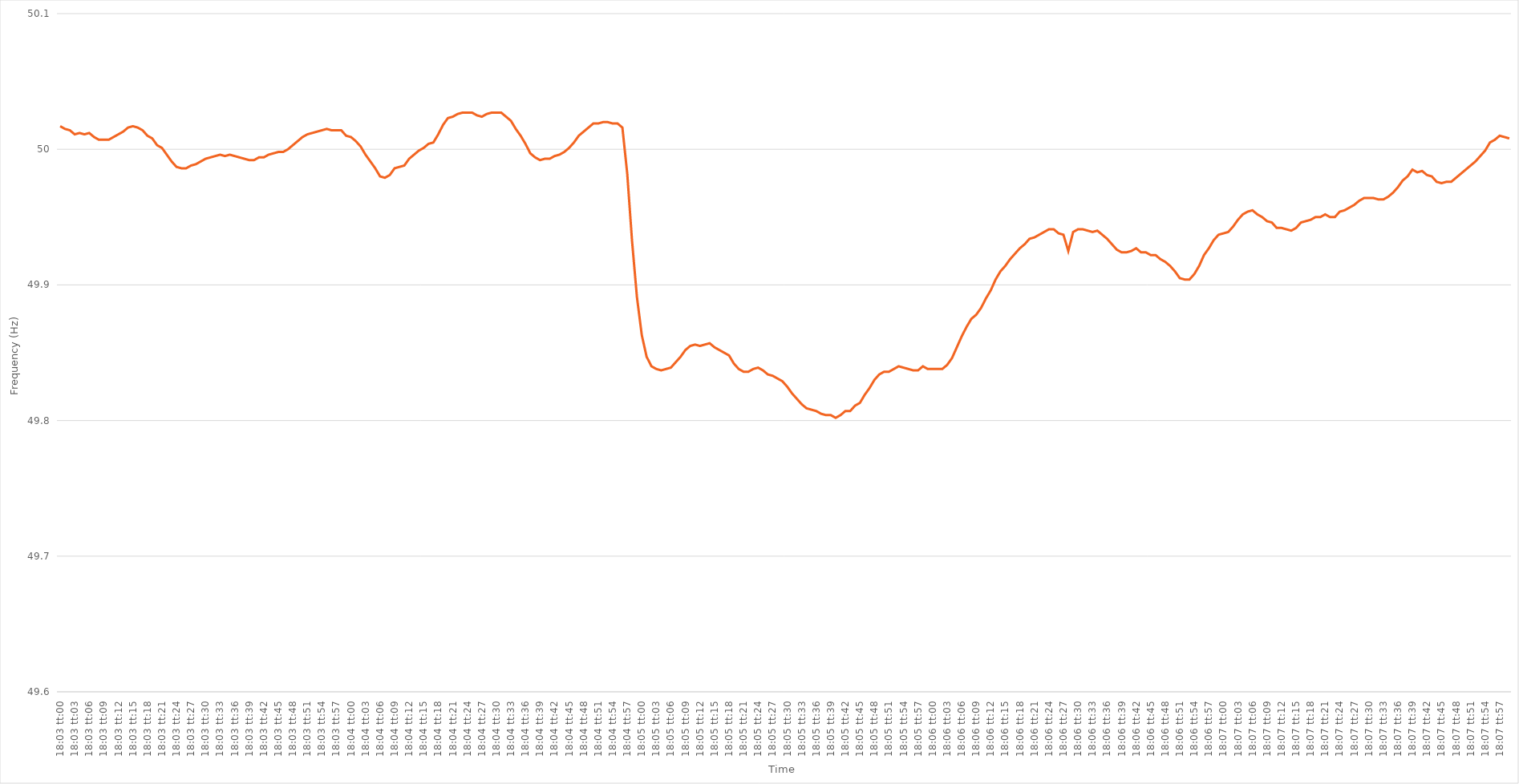
| Category | Series 0 |
|---|---|
| 0.7520833333333333 | 50.017 |
| 0.7520949074074075 | 50.015 |
| 0.7521064814814814 | 50.014 |
| 0.7521180555555556 | 50.011 |
| 0.7521296296296297 | 50.012 |
| 0.7521412037037036 | 50.011 |
| 0.7521527777777778 | 50.012 |
| 0.7521643518518518 | 50.009 |
| 0.752175925925926 | 50.007 |
| 0.7521874999999999 | 50.007 |
| 0.752199074074074 | 50.007 |
| 0.7522106481481482 | 50.009 |
| 0.7522222222222222 | 50.011 |
| 0.7522337962962963 | 50.013 |
| 0.7522453703703703 | 50.016 |
| 0.7522569444444445 | 50.017 |
| 0.7522685185185186 | 50.016 |
| 0.7522800925925925 | 50.014 |
| 0.7522916666666667 | 50.01 |
| 0.7523032407407407 | 50.008 |
| 0.7523148148148149 | 50.003 |
| 0.7523263888888888 | 50.001 |
| 0.752337962962963 | 49.996 |
| 0.7523495370370371 | 49.991 |
| 0.7523611111111111 | 49.987 |
| 0.7523726851851852 | 49.986 |
| 0.7523842592592592 | 49.986 |
| 0.7523958333333334 | 49.988 |
| 0.7524074074074073 | 49.989 |
| 0.7524189814814815 | 49.991 |
| 0.7524305555555556 | 49.993 |
| 0.7524421296296296 | 49.994 |
| 0.7524537037037037 | 49.995 |
| 0.7524652777777777 | 49.996 |
| 0.7524768518518519 | 49.995 |
| 0.752488425925926 | 49.996 |
| 0.7525 | 49.995 |
| 0.7525115740740741 | 49.994 |
| 0.7525231481481481 | 49.993 |
| 0.7525347222222223 | 49.992 |
| 0.7525462962962962 | 49.992 |
| 0.7525578703703704 | 49.994 |
| 0.7525694444444445 | 49.994 |
| 0.7525810185185186 | 49.996 |
| 0.7525925925925926 | 49.997 |
| 0.7526041666666666 | 49.998 |
| 0.7526157407407408 | 49.998 |
| 0.7526273148148147 | 50 |
| 0.7526388888888889 | 50.003 |
| 0.752650462962963 | 50.006 |
| 0.752662037037037 | 50.009 |
| 0.7526736111111111 | 50.011 |
| 0.7526851851851851 | 50.012 |
| 0.7526967592592593 | 50.013 |
| 0.7527083333333334 | 50.014 |
| 0.7527199074074074 | 50.015 |
| 0.7527314814814815 | 50.014 |
| 0.7527430555555555 | 50.014 |
| 0.7527546296296297 | 50.014 |
| 0.7527662037037036 | 50.01 |
| 0.7527777777777778 | 50.009 |
| 0.7527893518518519 | 50.006 |
| 0.752800925925926 | 50.002 |
| 0.7528125 | 49.996 |
| 0.752824074074074 | 49.991 |
| 0.7528356481481482 | 49.986 |
| 0.7528472222222221 | 49.98 |
| 0.7528587962962963 | 49.979 |
| 0.7528703703703704 | 49.981 |
| 0.7528819444444445 | 49.986 |
| 0.7528935185185185 | 49.987 |
| 0.7529050925925925 | 49.988 |
| 0.7529166666666667 | 49.993 |
| 0.7529282407407408 | 49.996 |
| 0.7529398148148148 | 49.999 |
| 0.7529513888888889 | 50.001 |
| 0.752962962962963 | 50.004 |
| 0.7529745370370371 | 50.005 |
| 0.752986111111111 | 50.011 |
| 0.7529976851851852 | 50.018 |
| 0.7530092592592593 | 50.023 |
| 0.7530208333333334 | 50.024 |
| 0.7530324074074074 | 50.026 |
| 0.7530439814814814 | 50.027 |
| 0.7530555555555556 | 50.027 |
| 0.7530671296296297 | 50.027 |
| 0.7530787037037037 | 50.025 |
| 0.7530902777777778 | 50.024 |
| 0.7531018518518519 | 50.026 |
| 0.7531134259259259 | 50.027 |
| 0.7531249999999999 | 50.027 |
| 0.7531365740740741 | 50.027 |
| 0.7531481481481482 | 50.024 |
| 0.7531597222222222 | 50.021 |
| 0.7531712962962963 | 50.015 |
| 0.7531828703703703 | 50.01 |
| 0.7531944444444445 | 50.004 |
| 0.7532060185185184 | 49.997 |
| 0.7532175925925926 | 49.994 |
| 0.7532291666666667 | 49.992 |
| 0.7532407407407408 | 49.993 |
| 0.7532523148148148 | 49.993 |
| 0.7532638888888888 | 49.995 |
| 0.753275462962963 | 49.996 |
| 0.7532870370370371 | 49.998 |
| 0.7532986111111111 | 50.001 |
| 0.7533101851851852 | 50.005 |
| 0.7533217592592593 | 50.01 |
| 0.7533333333333333 | 50.013 |
| 0.7533449074074073 | 50.016 |
| 0.7533564814814815 | 50.019 |
| 0.7533680555555556 | 50.019 |
| 0.7533796296296296 | 50.02 |
| 0.7533912037037037 | 50.02 |
| 0.7534027777777778 | 50.019 |
| 0.7534143518518519 | 50.019 |
| 0.7534259259259258 | 50.016 |
| 0.7534375 | 49.982 |
| 0.7534490740740741 | 49.932 |
| 0.7534606481481482 | 49.891 |
| 0.7534722222222222 | 49.863 |
| 0.7534837962962962 | 49.847 |
| 0.7534953703703704 | 49.84 |
| 0.7535069444444445 | 49.838 |
| 0.7535185185185185 | 49.837 |
| 0.7535300925925926 | 49.838 |
| 0.7535416666666667 | 49.839 |
| 0.7535532407407407 | 49.843 |
| 0.7535648148148147 | 49.847 |
| 0.7535763888888889 | 49.852 |
| 0.753587962962963 | 49.855 |
| 0.753599537037037 | 49.856 |
| 0.7536111111111111 | 49.855 |
| 0.7536226851851852 | 49.856 |
| 0.7536342592592593 | 49.857 |
| 0.7536458333333332 | 49.854 |
| 0.7536574074074074 | 49.852 |
| 0.7536689814814815 | 49.85 |
| 0.7536805555555556 | 49.848 |
| 0.7536921296296296 | 49.842 |
| 0.7537037037037037 | 49.838 |
| 0.7537152777777778 | 49.836 |
| 0.753726851851852 | 49.836 |
| 0.7537384259259259 | 49.838 |
| 0.75375 | 49.839 |
| 0.7537615740740741 | 49.837 |
| 0.7537731481481482 | 49.834 |
| 0.7537847222222221 | 49.833 |
| 0.7537962962962963 | 49.831 |
| 0.7538078703703704 | 49.829 |
| 0.7538194444444444 | 49.825 |
| 0.7538310185185185 | 49.82 |
| 0.7538425925925926 | 49.816 |
| 0.7538541666666667 | 49.812 |
| 0.7538657407407406 | 49.809 |
| 0.7538773148148148 | 49.808 |
| 0.7538888888888889 | 49.807 |
| 0.753900462962963 | 49.805 |
| 0.753912037037037 | 49.804 |
| 0.7539236111111111 | 49.804 |
| 0.7539351851851852 | 49.802 |
| 0.7539467592592594 | 49.804 |
| 0.7539583333333333 | 49.807 |
| 0.7539699074074074 | 49.807 |
| 0.7539814814814815 | 49.811 |
| 0.7539930555555556 | 49.813 |
| 0.7540046296296296 | 49.819 |
| 0.7540162037037037 | 49.824 |
| 0.7540277777777779 | 49.83 |
| 0.7540393518518518 | 49.834 |
| 0.7540509259259259 | 49.836 |
| 0.7540625 | 49.836 |
| 0.7540740740740741 | 49.838 |
| 0.754085648148148 | 49.84 |
| 0.7540972222222222 | 49.839 |
| 0.7541087962962963 | 49.838 |
| 0.7541203703703704 | 49.837 |
| 0.7541319444444444 | 49.837 |
| 0.7541435185185185 | 49.84 |
| 0.7541550925925926 | 49.838 |
| 0.7541666666666668 | 49.838 |
| 0.7541782407407407 | 49.838 |
| 0.7541898148148148 | 49.838 |
| 0.7542013888888889 | 49.841 |
| 0.754212962962963 | 49.846 |
| 0.754224537037037 | 49.854 |
| 0.7542361111111111 | 49.862 |
| 0.7542476851851853 | 49.869 |
| 0.7542592592592593 | 49.875 |
| 0.7542708333333333 | 49.878 |
| 0.7542824074074074 | 49.883 |
| 0.7542939814814815 | 49.89 |
| 0.7543055555555555 | 49.896 |
| 0.7543171296296296 | 49.904 |
| 0.7543287037037038 | 49.91 |
| 0.7543402777777778 | 49.914 |
| 0.7543518518518518 | 49.919 |
| 0.7543634259259259 | 49.923 |
| 0.754375 | 49.927 |
| 0.7543865740740742 | 49.93 |
| 0.7543981481481481 | 49.934 |
| 0.7544097222222222 | 49.935 |
| 0.7544212962962963 | 49.937 |
| 0.7544328703703704 | 49.939 |
| 0.7544444444444444 | 49.941 |
| 0.7544560185185185 | 49.941 |
| 0.7544675925925927 | 49.938 |
| 0.7544791666666667 | 49.937 |
| 0.7544907407407407 | 49.925 |
| 0.7545023148148148 | 49.939 |
| 0.7545138888888889 | 49.941 |
| 0.7545254629629629 | 49.941 |
| 0.754537037037037 | 49.94 |
| 0.7545486111111112 | 49.939 |
| 0.7545601851851852 | 49.94 |
| 0.7545717592592592 | 49.937 |
| 0.7545833333333333 | 49.934 |
| 0.7545949074074074 | 49.93 |
| 0.7546064814814816 | 49.926 |
| 0.7546180555555555 | 49.924 |
| 0.7546296296296297 | 49.924 |
| 0.7546412037037037 | 49.925 |
| 0.7546527777777778 | 49.927 |
| 0.7546643518518518 | 49.924 |
| 0.7546759259259259 | 49.924 |
| 0.7546875000000001 | 49.922 |
| 0.7546990740740741 | 49.922 |
| 0.7547106481481481 | 49.919 |
| 0.7547222222222222 | 49.917 |
| 0.7547337962962963 | 49.914 |
| 0.7547453703703703 | 49.91 |
| 0.7547569444444444 | 49.905 |
| 0.7547685185185186 | 49.904 |
| 0.7547800925925926 | 49.904 |
| 0.7547916666666666 | 49.908 |
| 0.7548032407407407 | 49.914 |
| 0.7548148148148148 | 49.922 |
| 0.754826388888889 | 49.927 |
| 0.7548379629629629 | 49.933 |
| 0.754849537037037 | 49.937 |
| 0.7548611111111111 | 49.938 |
| 0.7548726851851852 | 49.939 |
| 0.7548842592592592 | 49.943 |
| 0.7548958333333333 | 49.948 |
| 0.7549074074074075 | 49.952 |
| 0.7549189814814815 | 49.954 |
| 0.7549305555555555 | 49.955 |
| 0.7549421296296296 | 49.952 |
| 0.7549537037037037 | 49.95 |
| 0.7549652777777779 | 49.947 |
| 0.7549768518518518 | 49.946 |
| 0.754988425925926 | 49.942 |
| 0.755 | 49.942 |
| 0.755011574074074 | 49.941 |
| 0.7550231481481481 | 49.94 |
| 0.7550347222222222 | 49.942 |
| 0.7550462962962964 | 49.946 |
| 0.7550578703703703 | 49.947 |
| 0.7550694444444445 | 49.948 |
| 0.7550810185185185 | 49.95 |
| 0.7550925925925926 | 49.95 |
| 0.7551041666666666 | 49.952 |
| 0.7551157407407407 | 49.95 |
| 0.7551273148148149 | 49.95 |
| 0.7551388888888889 | 49.954 |
| 0.755150462962963 | 49.955 |
| 0.755162037037037 | 49.957 |
| 0.7551736111111111 | 49.959 |
| 0.7551851851851853 | 49.962 |
| 0.7551967592592592 | 49.964 |
| 0.7552083333333334 | 49.964 |
| 0.7552199074074074 | 49.964 |
| 0.7552314814814814 | 49.963 |
| 0.7552430555555555 | 49.963 |
| 0.7552546296296296 | 49.965 |
| 0.7552662037037038 | 49.968 |
| 0.7552777777777777 | 49.972 |
| 0.7552893518518519 | 49.977 |
| 0.7553009259259259 | 49.98 |
| 0.7553125 | 49.985 |
| 0.755324074074074 | 49.983 |
| 0.7553356481481481 | 49.984 |
| 0.7553472222222223 | 49.981 |
| 0.7553587962962963 | 49.98 |
| 0.7553703703703704 | 49.976 |
| 0.7553819444444444 | 49.975 |
| 0.7553935185185185 | 49.976 |
| 0.7554050925925927 | 49.976 |
| 0.7554166666666666 | 49.979 |
| 0.7554282407407408 | 49.982 |
| 0.7554398148148148 | 49.985 |
| 0.7554513888888889 | 49.988 |
| 0.7554629629629629 | 49.991 |
| 0.755474537037037 | 49.995 |
| 0.7554861111111112 | 49.999 |
| 0.7554976851851851 | 50.005 |
| 0.7555092592592593 | 50.007 |
| 0.7555208333333333 | 50.01 |
| 0.7555324074074075 | 50.009 |
| 0.7555439814814814 | 50.008 |